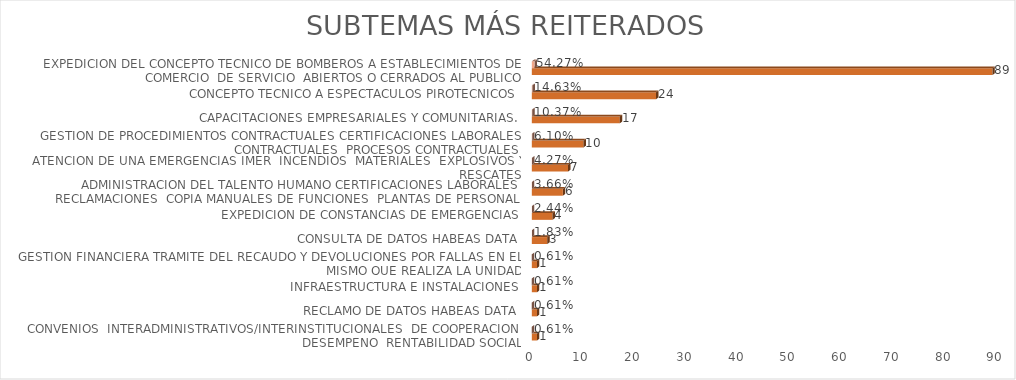
| Category | Cuenta de Número petición | Cuenta de Número petición2 |
|---|---|---|
| CONVENIOS  INTERADMINISTRATIVOS/INTERINSTITUCIONALES  DE COOPERACION  DESEMPENO  RENTABILIDAD SOCIAL | 1 | 0.006 |
| RECLAMO DE DATOS HABEAS DATA | 1 | 0.006 |
| INFRAESTRUCTURA E INSTALACIONES | 1 | 0.006 |
| GESTION FINANCIERA TRAMITE DEL RECAUDO Y DEVOLUCIONES POR FALLAS EN EL MISMO QUE REALIZA LA UNIDAD | 1 | 0.006 |
| CONSULTA DE DATOS HABEAS DATA | 3 | 0.018 |
| EXPEDICION DE CONSTANCIAS DE EMERGENCIAS | 4 | 0.024 |
| ADMINISTRACION DEL TALENTO HUMANO CERTIFICACIONES LABORALES  RECLAMACIONES  COPIA MANUALES DE FUNCIONES  PLANTAS DE PERSONAL  CAPACITACION A BOMBEROS | 6 | 0.037 |
| ATENCION DE UNA EMERGENCIAS IMER  INCENDIOS  MATERIALES  EXPLOSIVOS Y RESCATES | 7 | 0.043 |
| GESTION DE PROCEDIMIENTOS CONTRACTUALES CERTIFICACIONES LABORALES CONTRACTUALES  PROCESOS CONTRACTUALES | 10 | 0.061 |
| CAPACITACIONES EMPRESARIALES Y COMUNITARIAS. | 17 | 0.104 |
| CONCEPTO TECNICO A ESPECTACULOS PIROTECNICOS | 24 | 0.146 |
| EXPEDICION DEL CONCEPTO TECNICO DE BOMBEROS A ESTABLECIMIENTOS DE COMERCIO  DE SERVICIO  ABIERTOS O CERRADOS AL PUBLICO | 89 | 0.543 |